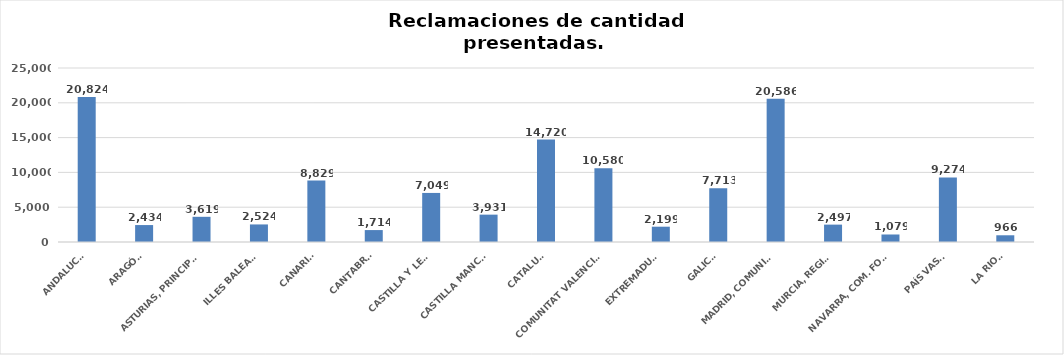
| Category | Series 0 |
|---|---|
| ANDALUCÍA | 20824 |
| ARAGÓN | 2434 |
| ASTURIAS, PRINCIPADO | 3619 |
| ILLES BALEARS | 2524 |
| CANARIAS | 8829 |
| CANTABRIA | 1714 |
| CASTILLA Y LEÓN | 7049 |
| CASTILLA MANCHA | 3931 |
| CATALUÑA | 14720 |
| COMUNITAT VALENCIANA | 10580 |
| EXTREMADURA | 2199 |
| GALICIA | 7713 |
| MADRID, COMUNIDAD | 20586 |
| MURCIA, REGIÓN | 2497 |
| NAVARRA, COM. FORAL | 1079 |
| PAÍS VASCO | 9274 |
| LA RIOJA | 966 |